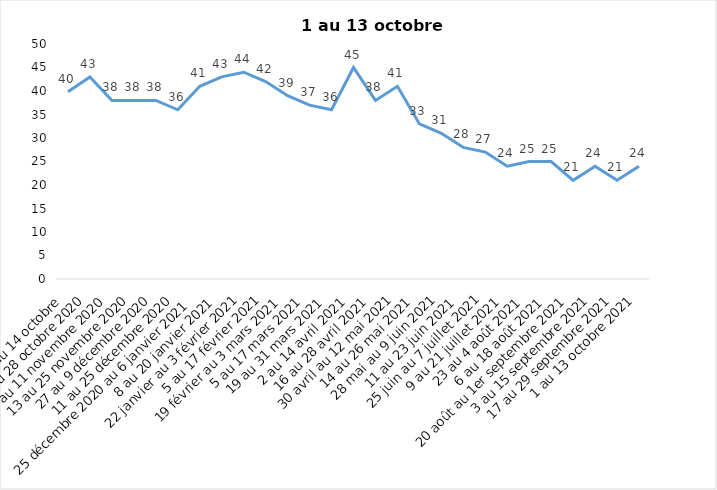
| Category | Toujours aux trois mesures |
|---|---|
| 2 au 14 octobre  | 39.85 |
| 16 au 28 octobre 2020 | 43 |
| 30 octobre au 11 novembre 2020 | 38 |
| 13 au 25 novembre 2020 | 38 |
| 27 au 9 décembre 2020 | 38 |
| 11 au 25 décembre 2020 | 36 |
| 25 décembre 2020 au 6 janvier 2021 | 41 |
| 8 au 20 janvier 2021 | 43 |
| 22 janvier au 3 février 2021 | 44 |
| 5 au 17 février 2021 | 42 |
| 19 février au 3 mars 2021 | 39 |
| 5 au 17 mars 2021 | 37 |
| 19 au 31 mars 2021 | 36 |
| 2 au 14 avril 2021 | 45 |
| 16 au 28 avril 2021 | 38 |
| 30 avril au 12 mai 2021 | 41 |
| 14 au 26 mai 2021 | 33 |
| 28 mai au 9 juin 2021 | 31 |
| 11 au 23 juin 2021 | 28 |
| 25 juin au 7 juillet 2021 | 27 |
| 9 au 21 juillet 2021 | 24 |
| 23 au 4 août 2021 | 25 |
| 6 au 18 août 2021 | 25 |
| 20 août au 1er septembre 2021 | 21 |
| 3 au 15 septembre 2021 | 24 |
| 17 au 29 septembre 2021 | 21 |
| 1 au 13 octobre 2021 | 24 |